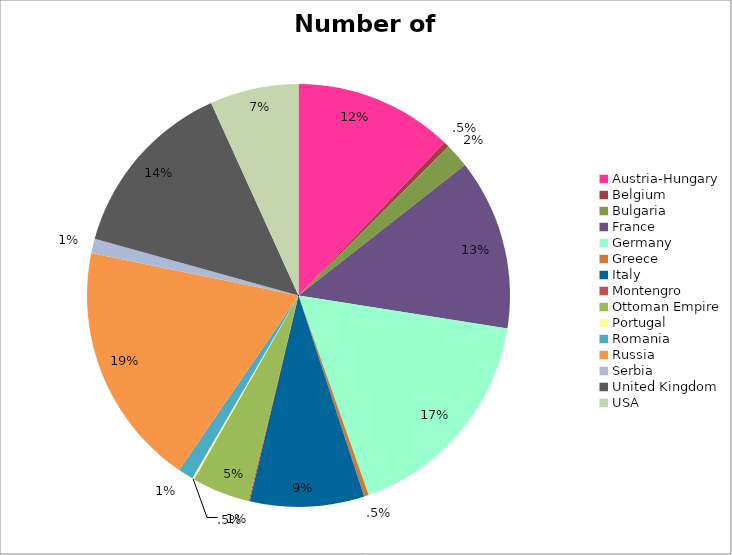
| Category | Number of Combatants |
|---|---|
| Austria-Hungary | 7800000 |
| Belgium | 267000 |
| Bulgaria | 1200000 |
| France | 8410000 |
| Germany | 11000000 |
| Greece | 230000 |
| Italy | 5615000 |
| Montengro | 50000 |
| Ottoman Empire | 2850000 |
| Portugal | 100000 |
| Romania | 750000 |
| Russia | 12000000 |
| Serbia | 707343 |
| United Kingdom | 8940000 |
| USA | 4355000 |